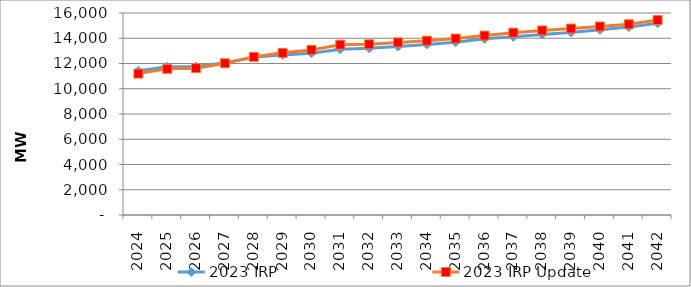
| Category | 2023 IRP | 2023 IRP Update |
|---|---|---|
| 2024.0 | 11427.393 | 11199.686 |
| 2025.0 | 11746.891 | 11576.216 |
| 2026.0 | 11758.166 | 11628.796 |
| 2027.0 | 12051.385 | 12019.364 |
| 2028.0 | 12484.837 | 12527.668 |
| 2029.0 | 12682.933 | 12843.623 |
| 2030.0 | 12815.474 | 13076.9 |
| 2031.0 | 13122.623 | 13491.327 |
| 2032.0 | 13208.785 | 13521.986 |
| 2033.0 | 13347.302 | 13669.908 |
| 2034.0 | 13512.468 | 13807.251 |
| 2035.0 | 13691.7 | 13972.995 |
| 2036.0 | 13953.233 | 14211.547 |
| 2037.0 | 14117.739 | 14443.933 |
| 2038.0 | 14299.512 | 14617.833 |
| 2039.0 | 14463.568 | 14767.456 |
| 2040.0 | 14671.815 | 14930.482 |
| 2041.0 | 14881.869 | 15106.39 |
| 2042.0 | 15186.938 | 15437.045 |